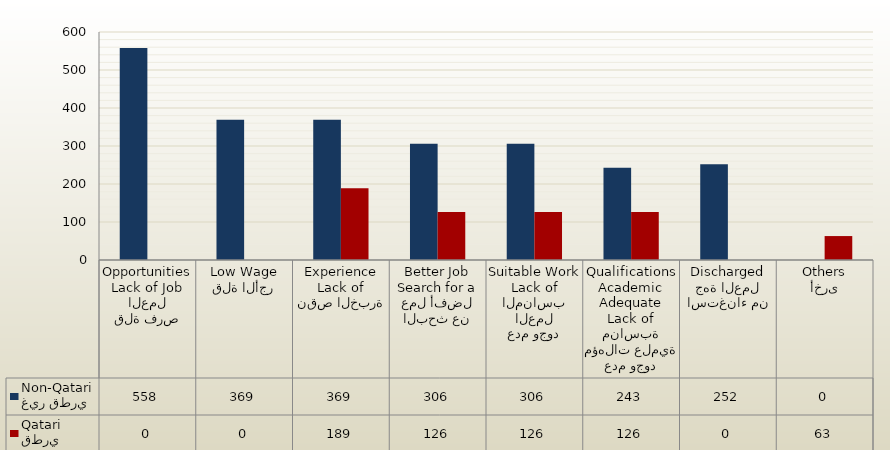
| Category | غير قطري
Non-Qatari | قطري
Qatari |
|---|---|---|
| قلة فرص العمل
Lack of Job Opportunities | 558 | 0 |
| قلة الأجر
Low Wage | 369 | 0 |
| نقص الخبرة
Lack of Experience | 369 | 189 |
| البحث عن عمل أفضل
Search for a Better Job | 306 | 126 |
| عدم وجود العمل المناسب
Lack of Suitable Work | 306 | 126 |
| عدم وجود مؤهلات علمية مناسبة
Lack of Adequate Academic Qualifications | 243 | 126 |
| استغناء من جهة العمل
Discharged | 252 | 0 |
| أخرى
Others | 0 | 63 |